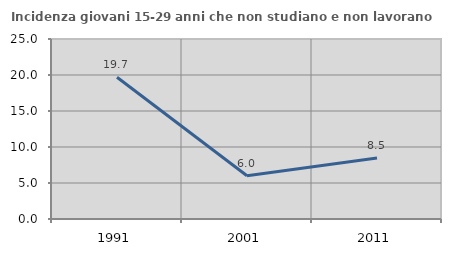
| Category | Incidenza giovani 15-29 anni che non studiano e non lavorano  |
|---|---|
| 1991.0 | 19.695 |
| 2001.0 | 6.015 |
| 2011.0 | 8.471 |